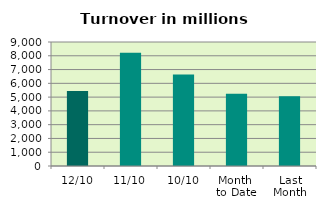
| Category | Series 0 |
|---|---|
| 12/10 | 5447.757 |
| 11/10 | 8217.975 |
| 10/10 | 6638.511 |
| Month 
to Date | 5251.159 |
| Last
Month | 5068.328 |